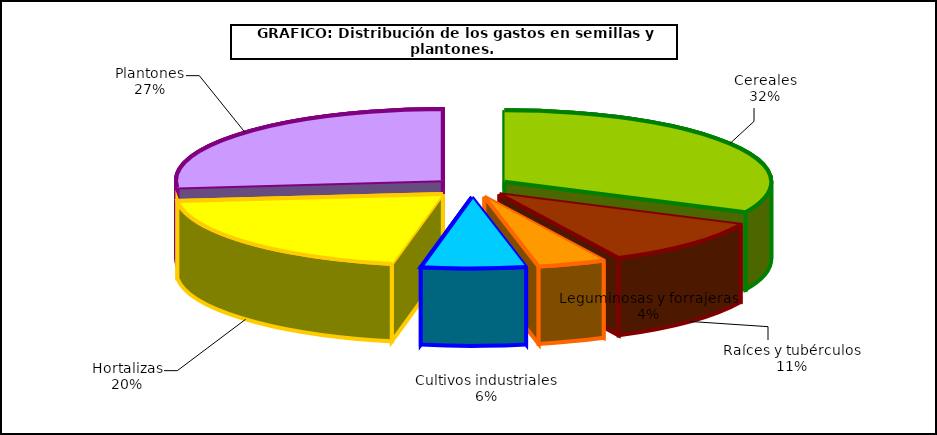
| Category | Series 0 |
|---|---|
| 0 | 310.806 |
| 1 | 102.771 |
| 2 | 39.947 |
| 3 | 61.355 |
| 4 | 197.503 |
| 5 | 257.88 |